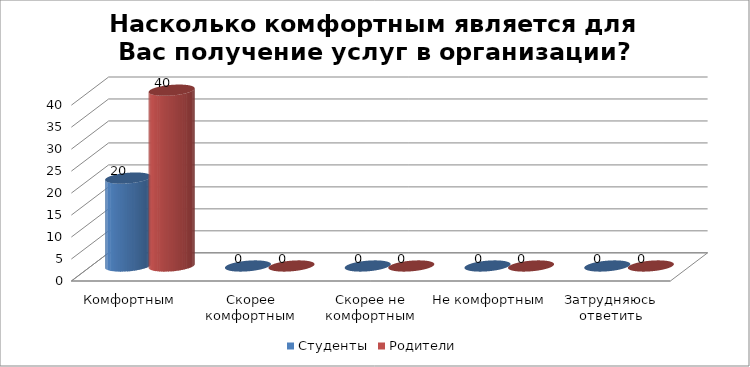
| Category | Студенты | Родители |
|---|---|---|
| Комфортным | 20 | 40 |
| Скорее комфортным | 0 | 0 |
| Скорее не комфортным | 0 | 0 |
| Не комфортным | 0 | 0 |
| Затрудняюсь ответить | 0 | 0 |